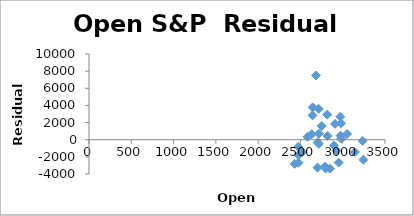
| Category | Series 0 |
|---|---|
| 2431.389893 | -2818.794 |
| 2477.100098 | -2677.453 |
| 2474.419922 | -833.076 |
| 2521.199951 | -1436.699 |
| 2583.209961 | 341.223 |
| 2645.100098 | 3777.477 |
| 2683.72998 | 7490.485 |
| 2816.449951 | 2926.412 |
| 2715.219971 | 3599.767 |
| 2633.449951 | 642.433 |
| 2642.959961 | 2841.46 |
| 2718.699951 | 697.397 |
| 2704.949951 | -320.224 |
| 2821.169922 | 433.643 |
| 2896.959961 | -684.14 |
| 2926.290039 | -1261.402 |
| 2717.580078 | -479.348 |
| 2790.5 | -3151.673 |
| 2476.959961 | -1801.312 |
| 2702.320068 | -3257.701 |
| 2798.219971 | -3362.468 |
| 2848.629883 | -3372.625 |
| 2952.330078 | -2665.555 |
| 2751.530029 | 1600.061 |
| 2971.409912 | 2681.386 |
| 2980.320068 | 1915.63 |
| 2909.01001 | 1839.071 |
| 2983.689941 | 120.41 |
| 3050.719971 | 666.616 |
| 3143.850098 | -1439.355 |
| 3244.669922 | -2339.604 |
| 3235.659912 | -141.353 |
| 2974.280029 | 469.31 |